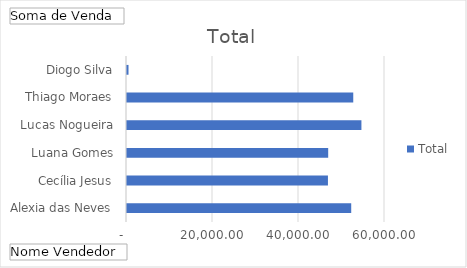
| Category | Total |
|---|---|
| Alexia das Neves | 52143 |
| Cecília Jesus | 46731 |
| Luana Gomes | 46789 |
| Lucas Nogueira | 54517 |
| Thiago Moraes | 52618 |
| Diogo Silva | 350 |